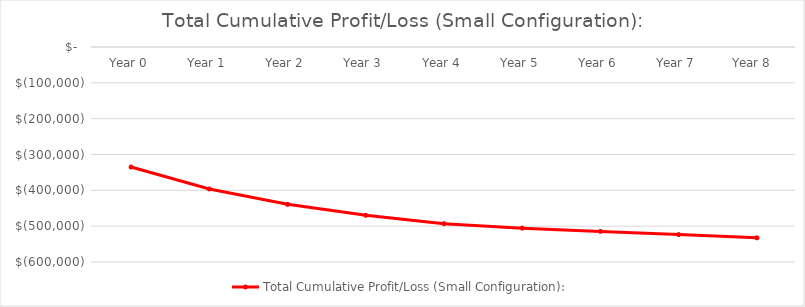
| Category | Total Cumulative Profit/Loss (Small Configuration): |
|---|---|
| Year 0 | -335000 |
| Year 1 | -396204.48 |
| Year 2 | -439074.96 |
| Year 3 | -469650.44 |
| Year 4 | -493025.92 |
| Year 5 | -505601.4 |
| Year 6 | -514576.88 |
| Year 7 | -523552.36 |
| Year 8  | -532527.84 |